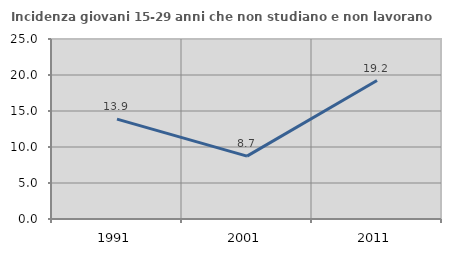
| Category | Incidenza giovani 15-29 anni che non studiano e non lavorano  |
|---|---|
| 1991.0 | 13.864 |
| 2001.0 | 8.732 |
| 2011.0 | 19.231 |